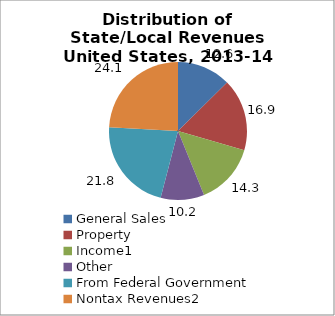
| Category | Series 0 |
|---|---|
| General Sales | 12.588 |
| Property | 16.91 |
| Income1 | 14.347 |
| Other | 10.208 |
| From Federal Government | 21.835 |
| Nontax Revenues2 | 24.113 |